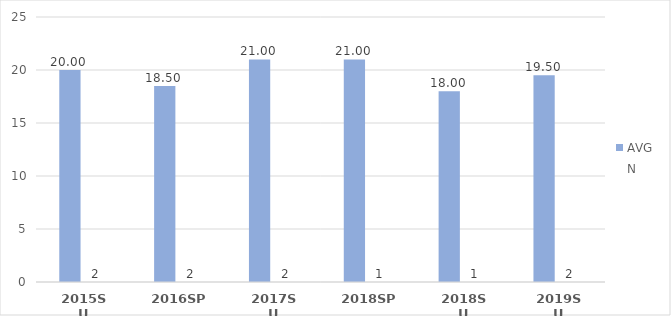
| Category | AVG | N |
|---|---|---|
| 2015SU | 20 | 2 |
| 2016SP | 18.5 | 2 |
| 2017SU | 21 | 2 |
| 2018SP | 21 | 1 |
| 2018SU | 18 | 1 |
| 2019SU | 19.5 | 2 |